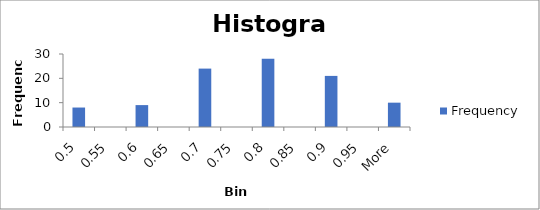
| Category | Frequency |
|---|---|
| 0.5 | 8 |
| 0.55 | 0 |
| 0.6 | 9 |
| 0.65 | 0 |
| 0.7 | 24 |
| 0.75 | 0 |
| 0.8 | 28 |
| 0.85 | 0 |
| 0.9 | 21 |
| 0.95 | 0 |
| More | 10 |